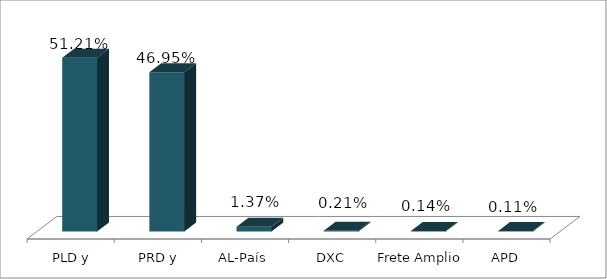
| Category | Votos % |
|---|---|
| PLD y aliados | 0.512 |
| PRD y aliados | 0.47 |
| AL-País | 0.014 |
| DXC | 0.002 |
| Frete Amplio | 0.001 |
| APD | 0.001 |